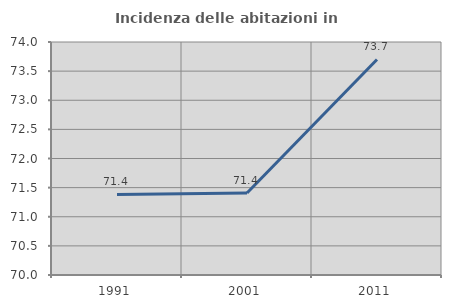
| Category | Incidenza delle abitazioni in proprietà  |
|---|---|
| 1991.0 | 71.383 |
| 2001.0 | 71.407 |
| 2011.0 | 73.7 |